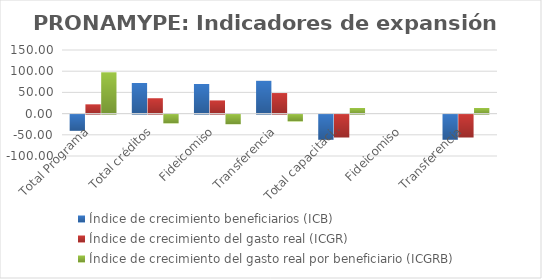
| Category | Índice de crecimiento beneficiarios (ICB)  | Índice de crecimiento del gasto real (ICGR)  | Índice de crecimiento del gasto real por beneficiario (ICGRB)  |
|---|---|---|---|
| Total Programa | -38.263 | 21.873 | 97.406 |
| Total créditos | 72.139 | 36.253 | -20.847 |
| Fideicomiso | 69.856 | 31.082 | -22.827 |
| Transferencia | 77.297 | 48.473 | -16.258 |
| Total capacitación | -59.397 | -54.021 | 13.24 |
| Fideicomiso | 0 | 0 | 0 |
| Transferencia | -59.397 | -54.021 | 13.24 |